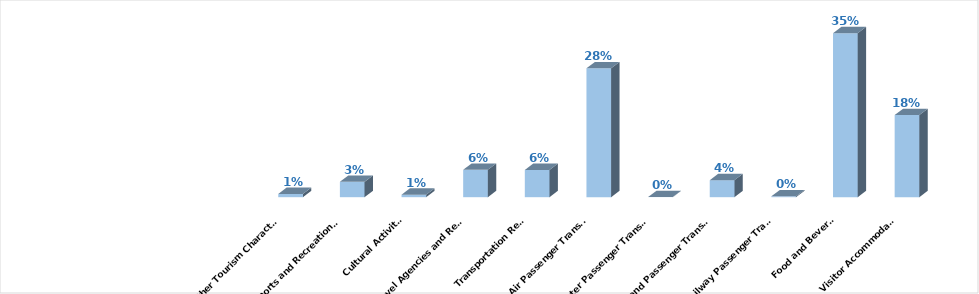
| Category | Series 0 |
|---|---|
| Visitor Accommodation | 0.175 |
| Food and Beverage | 0.35 |
| Railway Passenger Transport | 0.002 |
| Land Passenger Transport | 0.036 |
| Water Passenger Transport | 0 |
| Air Passenger Transport | 0.275 |
| Transportation Rental | 0.058 |
| Travel Agencies and Reservation Services | 0.058 |
| Cultural Activities | 0.005 |
| Sports and Recreational Activities | 0.033 |
| Other Tourism Characteristic Services | 0.007 |